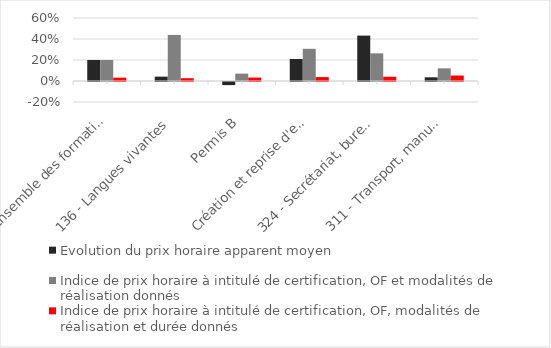
| Category | Evolution du prix horaire apparent moyen | Indice de prix horaire à intitulé de certification, OF et modalités de réalisation donnés | Indice de prix horaire à intitulé de certification, OF, modalités de réalisation et durée donnés |
|---|---|---|---|
| Ensemble des formations | 0.2 | 0.2 | 0.032 |
| 136 - Langues vivantes | 0.042 | 0.439 | 0.027 |
| Permis B | -0.03 | 0.07 | 0.033 |
| Création et reprise d'entreprise | 0.209 | 0.307 | 0.037 |
| 324 - Secrétariat, bureautique | 0.432 | 0.263 | 0.041 |
| 311 - Transport, manutention, magasinage | 0.035 | 0.121 | 0.052 |